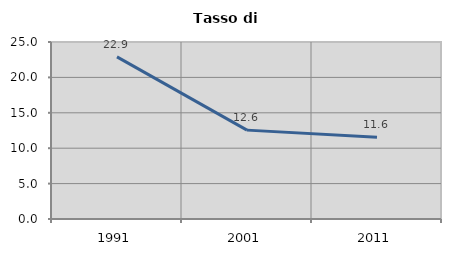
| Category | Tasso di disoccupazione   |
|---|---|
| 1991.0 | 22.904 |
| 2001.0 | 12.553 |
| 2011.0 | 11.552 |